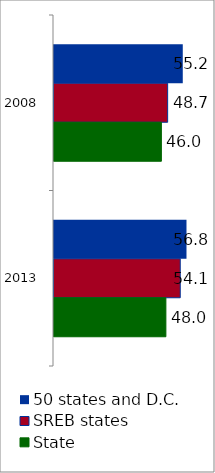
| Category | 50 states and D.C. | SREB states | State |
|---|---|---|---|
| 2008 | 55.189 | 48.705 | 46.023 |
| 2013 | 56.782 | 54.102 | 47.952 |